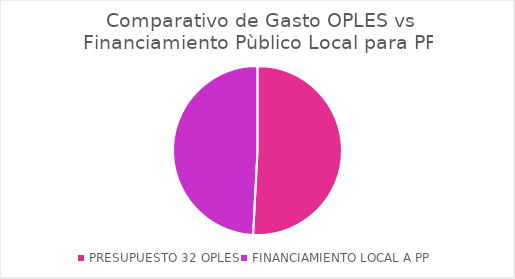
| Category | Series 0 |
|---|---|
| PRESUPUESTO 32 OPLES | 4833602064.44 |
| FINANCIAMIENTO LOCAL A PP  | 4676568681.97 |